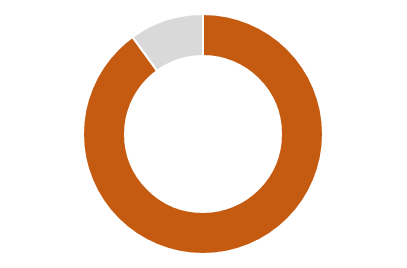
| Category | Data Series |
|---|---|
| 0 | 0.9 |
| 1 | 0 |
| 2 | 0 |
| 3 | 0.1 |